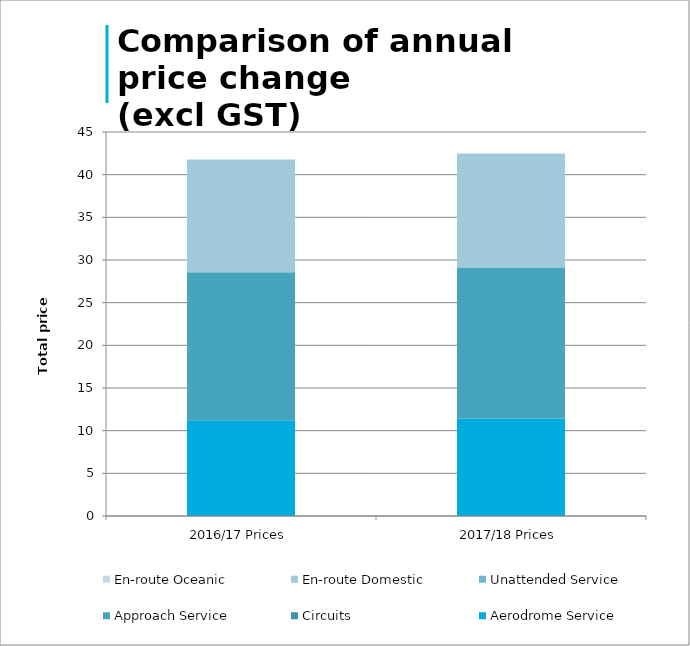
| Category | Aerodrome Service | Circuits | Approach Service | Unattended Service | En-route Domestic | En-route Oceanic |
|---|---|---|---|---|---|---|
| 2016/17 Prices | 11.23 | 0 | 17.34 | 0 | 13.21 | 0 |
| 2017/18 Prices | 11.43 | 0 | 17.62 | 0 | 13.42 | 0 |